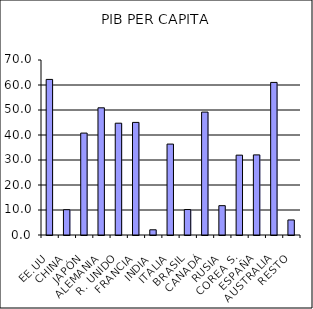
| Category | Series 0 |
|---|---|
| EE.UU | 62.235 |
| CHINA | 10.124 |
| JAPÓN | 40.765 |
| ALEMANIA | 50.87 |
| R. UNIDO | 44.723 |
| FRANCIA | 45.04 |
| INDIA | 2.086 |
| ITALIA | 36.367 |
| BRASIL | 10.186 |
| CANADÁ | 49.165 |
| RUSIA | 11.737 |
| COREA S. | 31.943 |
| ESPAÑA | 32.043 |
| AUSTRALIA | 61.035 |
| RESTO | 6.02 |